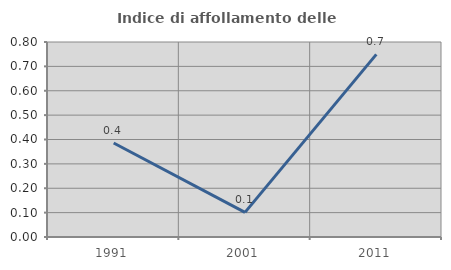
| Category | Indice di affollamento delle abitazioni  |
|---|---|
| 1991.0 | 0.385 |
| 2001.0 | 0.101 |
| 2011.0 | 0.749 |